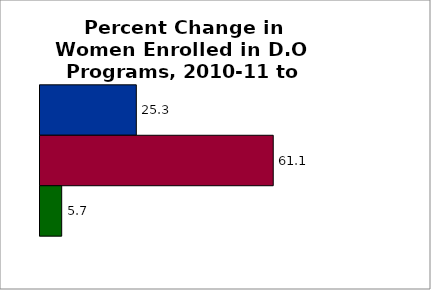
| Category | 50 states and D.C. | SREB states | State |
|---|---|---|---|
| 0 | 25.251 | 61.15 | 5.69 |